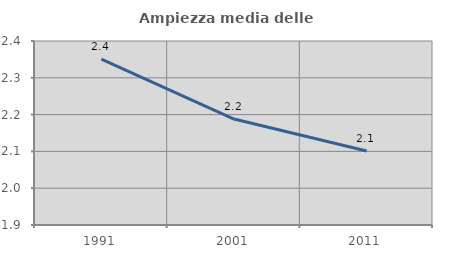
| Category | Ampiezza media delle famiglie |
|---|---|
| 1991.0 | 2.351 |
| 2001.0 | 2.188 |
| 2011.0 | 2.101 |